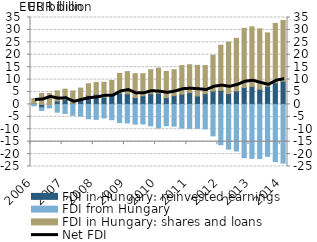
| Category | FDI in Hungary: reinvested earnings | FDI from Hungary | FDI in Hungary: shares and loans |
|---|---|---|---|
| 2006 | 0.422 | -0.545 | 1.917 |
| II. | -1.323 | -1.093 | 4.39 |
| III. | -0.052 | -1.355 | 4.434 |
| IV. | 1.359 | -3.127 | 4.096 |
| 2007 | 2.019 | -3.66 | 4.126 |
| II. | 0.506 | -4.385 | 4.923 |
| III. | 2.155 | -4.732 | 4.413 |
| IV. | 3.633 | -5.77 | 4.673 |
| 2008 | 4.139 | -6.036 | 4.711 |
| II. | 2.881 | -5.428 | 6.038 |
| III. | 3.392 | -6.155 | 6.25 |
| IV. | 4.528 | -7.284 | 7.969 |
| 2009 | 4.302 | -7.443 | 8.909 |
| II. | 2.705 | -7.934 | 9.666 |
| III. | 3.484 | -7.866 | 8.89 |
| IV. | 4.336 | -8.632 | 9.637 |
| 2010 | 4.532 | -9.489 | 10.09 |
| II. | 2.743 | -8.602 | 10.527 |
| III. | 3.54 | -8.768 | 10.442 |
| IV. | 4.15 | -9.519 | 11.498 |
| 2011 | 4.756 | -9.654 | 11.227 |
| II. | 3.4 | -9.606 | 12.33 |
| III. | 4.306 | -9.847 | 11.325 |
| IV. | 5.369 | -12.66 | 14.41 |
| 2012 | 5.639 | -16.229 | 18.172 |
| II. | 4.39 | -18.008 | 20.699 |
| III. | 5.459 | -18.745 | 21.164 |
| IV. | 6.82 | -21.46 | 23.81 |
| 2013 | 7.233 | -21.716 | 24.013 |
| II. | 6.112 | -21.77 | 24.319 |
| III. | 7.316 | -20.898 | 21.492 |
| IV. | 8.697 | -23.028 | 23.88 |
| 2014 | 9.366 | -23.624 | 24.443 |